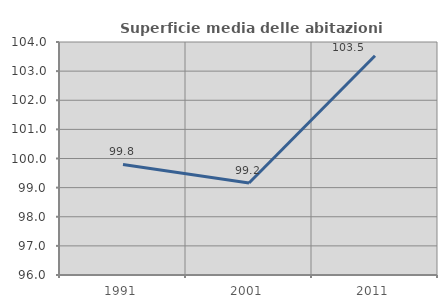
| Category | Superficie media delle abitazioni occupate |
|---|---|
| 1991.0 | 99.795 |
| 2001.0 | 99.161 |
| 2011.0 | 103.528 |